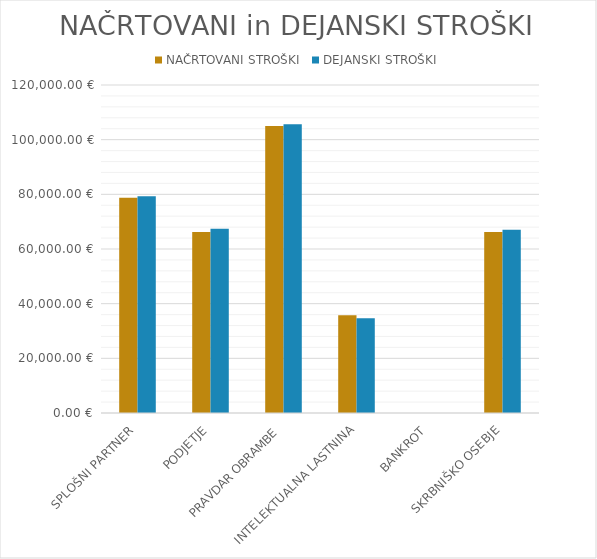
| Category | NAČRTOVANI STROŠKI | DEJANSKI STROŠKI |
|---|---|---|
| SPLOŠNI PARTNER | 78750 | 79275 |
| PODJETJE | 66250 | 67375 |
| PRAVDAR OBRAMBE | 105000 | 105600 |
| INTELEKTUALNA LASTNINA | 35750 | 34650 |
| BANKROT | 0 | 0 |
| SKRBNIŠKO OSEBJE | 66250 | 67000 |